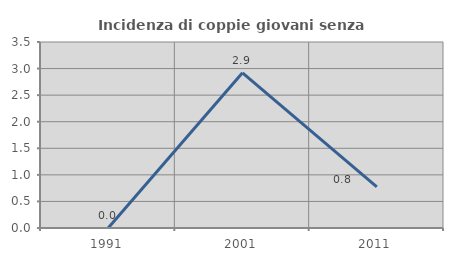
| Category | Incidenza di coppie giovani senza figli |
|---|---|
| 1991.0 | 0 |
| 2001.0 | 2.92 |
| 2011.0 | 0.775 |